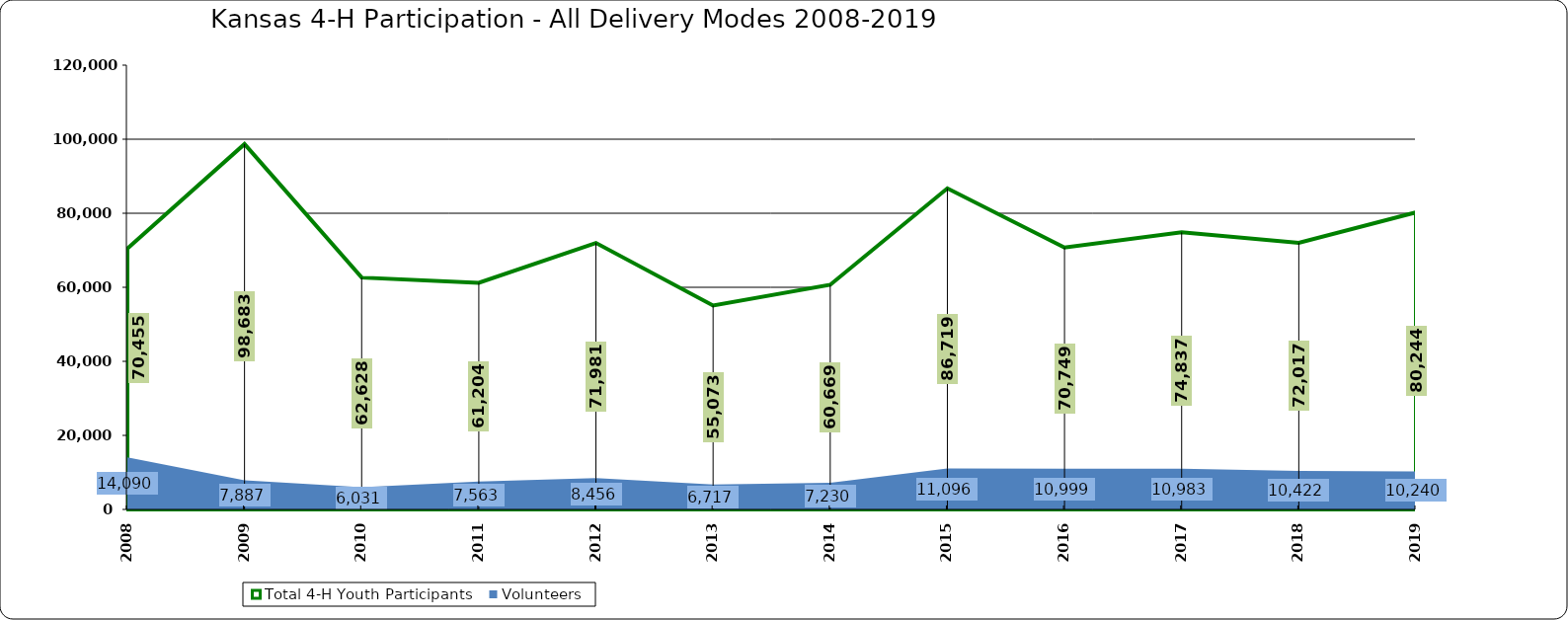
| Category | Total 4-H Youth Participants | Volunteers |
|---|---|---|
| 2008.0 | 70455 | 14090 |
| 2009.0 | 98683 | 7887 |
| 2010.0 | 62628 | 6031 |
| 2011.0 | 61204 | 7563 |
| 2012.0 | 71981 | 8456 |
| 2013.0 | 55073 | 6717 |
| 2014.0 | 60669 | 7230 |
| 2015.0 | 86719 | 11096 |
| 2016.0 | 70749 | 10999 |
| 2017.0 | 74837 | 10983 |
| 2018.0 | 72017 | 10422 |
| 2019.0 | 80244 | 10240 |